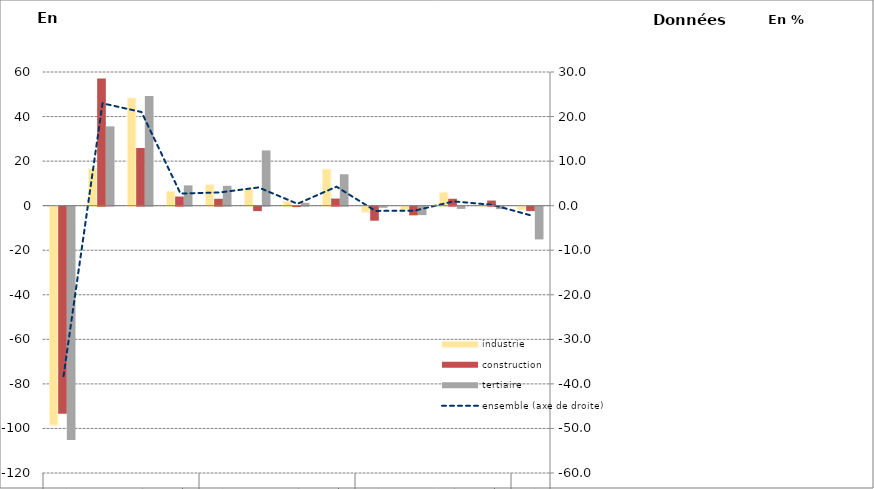
| Category | industrie | construction | tertiaire |
|---|---|---|---|
| 0 | -98.2 | -93 | -104.7 |
| 1 | 16.6 | 57.1 | 35.6 |
| 2 | 48.3 | 25.9 | 49.2 |
| 3 | 6.4 | 4.1 | 9.1 |
| 4 | 9.4 | 3.1 | 8.9 |
| 5 | 7.7 | -2 | 24.8 |
| 6 | 1.9 | -0.2 | 1.3 |
| 7 | 16.4 | 3.2 | 14.1 |
| 8 | -2.6 | -6.3 | -0.5 |
| 9 | -1.6 | -3.9 | -3.8 |
| 10 | 6 | 3.1 | -1 |
| 11 | 0.3 | 2.3 | -1.1 |
| 12 | -1.5 | -2 | -14.7 |